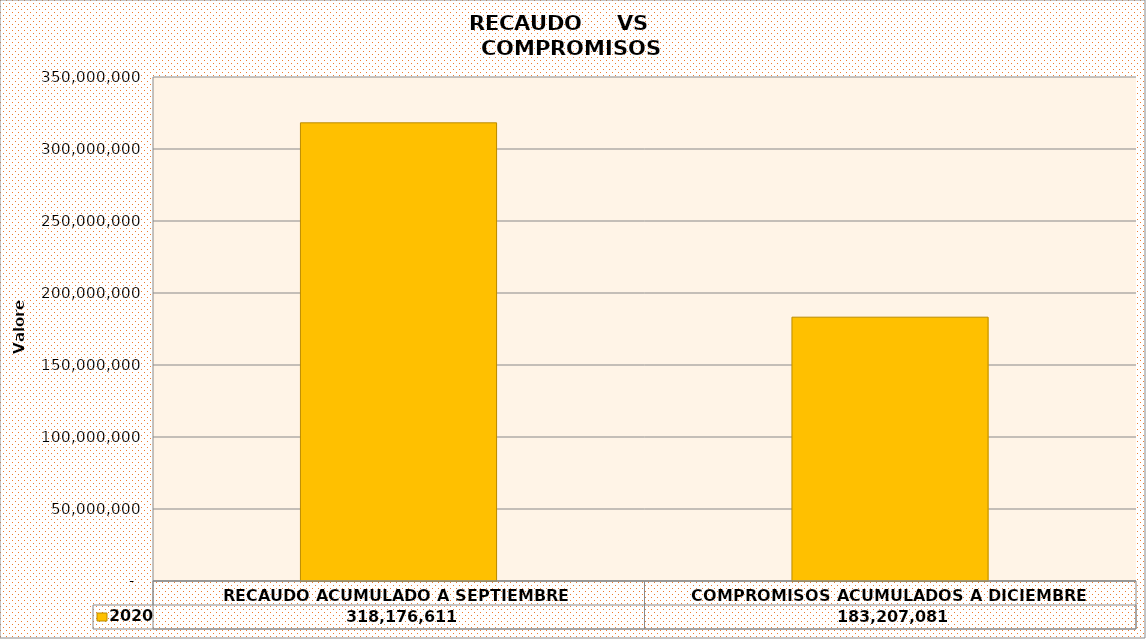
| Category | 2020 |
|---|---|
| RECAUDO ACUMULADO A SEPTIEMBRE | 318176611 |
| COMPROMISOS ACUMULADOS A DICIEMBRE | 183207081.06 |